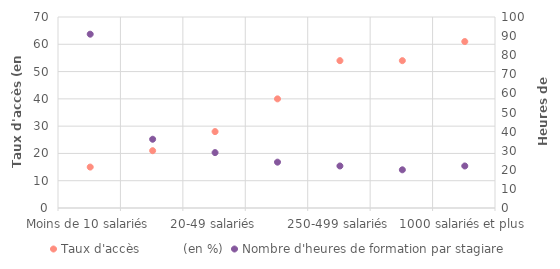
| Category | Taux d'accès           (en %) |
|---|---|
| Moins de 10 salariés | 15 |
| 10-19 salariés | 21 |
| 20-49 salariés | 28 |
| 50-249 salariés | 40 |
| 250-499 salariés | 54 |
| 500-999 salariés | 54 |
| 1000 salariés et plus | 61 |